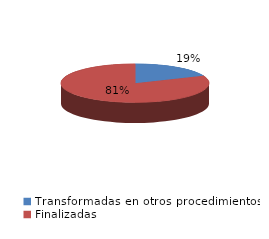
| Category | Series 0 |
|---|---|
| Transformadas en otros procedimientos | 4128 |
| Finalizadas | 17950 |